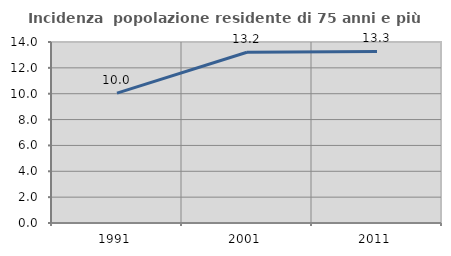
| Category | Incidenza  popolazione residente di 75 anni e più |
|---|---|
| 1991.0 | 10.041 |
| 2001.0 | 13.206 |
| 2011.0 | 13.273 |